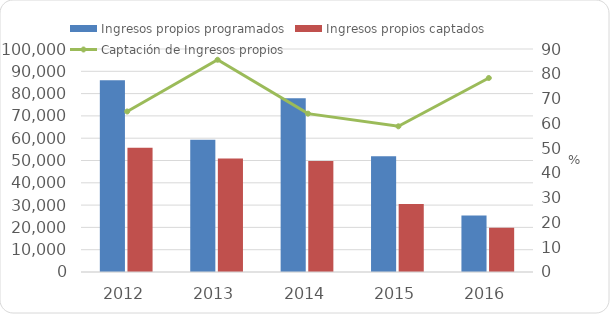
| Category | Ingresos propios programados | Ingresos propios captados  |
|---|---|---|
| 2012 | 86014.6 | 55717.433 |
| 2013 | 59356.6 | 50840.892 |
| 2014 | 77937 | 49810.516 |
| 2015 | 51955.052 | 30547.6 |
| 2016 | 25300.861 | 19808.7 |